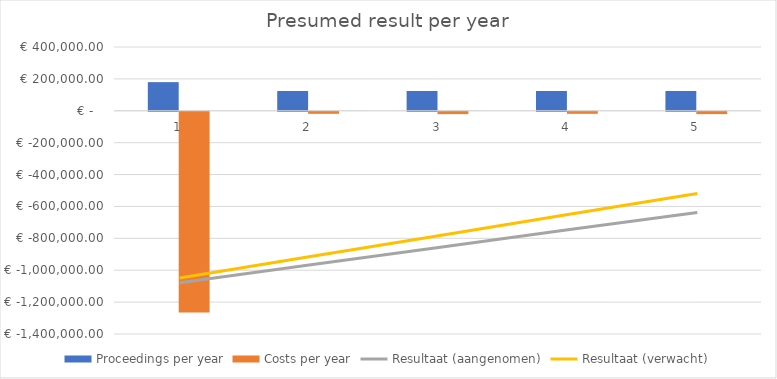
| Category | Proceedings per year | Costs per year |
|---|---|---|
| 1.0 | 179559.813 | -1258367.7 |
| 2.0 | 124021.973 | -12738.4 |
| 3.0 | 124021.973 | -14553.4 |
| 4.0 | 124021.973 | -12738.4 |
| 5.0 | 124021.973 | -14553.4 |